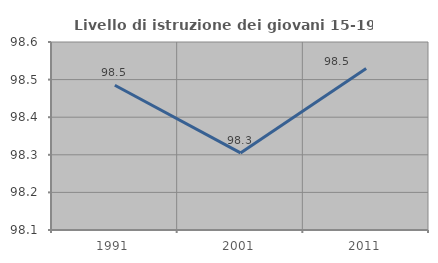
| Category | Livello di istruzione dei giovani 15-19 anni |
|---|---|
| 1991.0 | 98.485 |
| 2001.0 | 98.305 |
| 2011.0 | 98.529 |